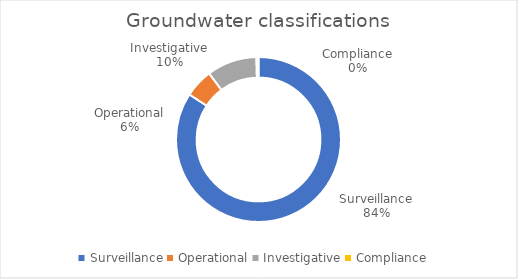
| Category | Series 0 |
|---|---|
| Surveillance | 0.842 |
| Operational | 0.056 |
| Investigative | 0.098 |
| Compliance | 0.004 |